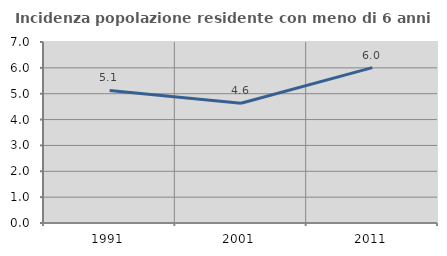
| Category | Incidenza popolazione residente con meno di 6 anni |
|---|---|
| 1991.0 | 5.126 |
| 2001.0 | 4.631 |
| 2011.0 | 6.009 |